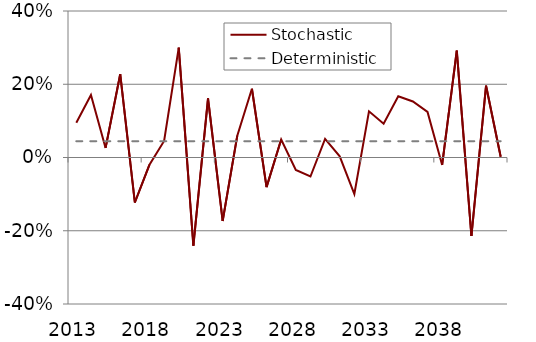
| Category | Stochastic | Deterministic |
|---|---|---|
| 2013.0 | 0.095 | 0.044 |
| 2014.0 | 0.171 | 0.044 |
| 2015.0 | 0.026 | 0.044 |
| 2016.0 | 0.227 | 0.044 |
| 2017.0 | -0.123 | 0.044 |
| 2018.0 | -0.02 | 0.044 |
| 2019.0 | 0.045 | 0.044 |
| 2020.0 | 0.3 | 0.044 |
| 2021.0 | -0.241 | 0.044 |
| 2022.0 | 0.162 | 0.044 |
| 2023.0 | -0.173 | 0.044 |
| 2024.0 | 0.06 | 0.044 |
| 2025.0 | 0.188 | 0.044 |
| 2026.0 | -0.081 | 0.044 |
| 2027.0 | 0.049 | 0.044 |
| 2028.0 | -0.034 | 0.044 |
| 2029.0 | -0.052 | 0.044 |
| 2030.0 | 0.051 | 0.044 |
| 2031.0 | 0.003 | 0.044 |
| 2032.0 | -0.1 | 0.044 |
| 2033.0 | 0.126 | 0.044 |
| 2034.0 | 0.092 | 0.044 |
| 2035.0 | 0.167 | 0.044 |
| 2036.0 | 0.153 | 0.044 |
| 2037.0 | 0.124 | 0.044 |
| 2038.0 | -0.02 | 0.044 |
| 2039.0 | 0.292 | 0.044 |
| 2040.0 | -0.214 | 0.044 |
| 2041.0 | 0.196 | 0.044 |
| 2042.0 | 0.002 | 0.044 |